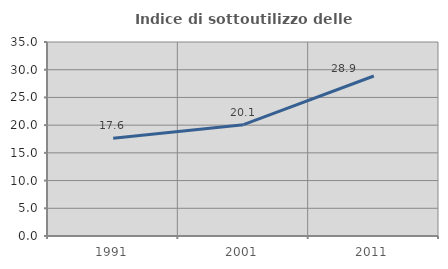
| Category | Indice di sottoutilizzo delle abitazioni  |
|---|---|
| 1991.0 | 17.639 |
| 2001.0 | 20.089 |
| 2011.0 | 28.867 |